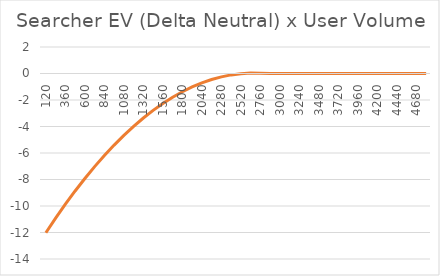
| Category | Searcher EV / User Volume  x Pool Fee |
|---|---|
| 120.0 | -12.02 |
| 240.0 | -10.916 |
| 360.0 | -9.865 |
| 480.0 | -8.867 |
| 600.0 | -7.921 |
| 720.0 | -7.028 |
| 840.0 | -6.188 |
| 960.0 | -5.401 |
| 1080.0 | -4.667 |
| 1200.0 | -3.986 |
| 1320.0 | -3.359 |
| 1440.0 | -2.784 |
| 1560.0 | -2.262 |
| 1680.0 | -1.794 |
| 1800.0 | -1.379 |
| 1920.0 | -1.017 |
| 2040.0 | -0.709 |
| 2160.0 | -0.455 |
| 2280.0 | -0.253 |
| 2400.0 | -0.106 |
| 2520.0 | -0.012 |
| 2640.0 | 0.028 |
| 2760.0 | 0.015 |
| 2880.0 | 0 |
| 3000.0 | 0 |
| 3120.0 | 0 |
| 3240.0 | 0 |
| 3360.0 | 0 |
| 3480.0 | 0 |
| 3600.0 | 0 |
| 3720.0 | 0 |
| 3840.0 | 0 |
| 3960.0 | 0 |
| 4080.0 | 0 |
| 4200.0 | 0 |
| 4320.0 | 0 |
| 4440.0 | 0 |
| 4560.0 | 0 |
| 4680.0 | 0 |
| 4800.0 | 0 |